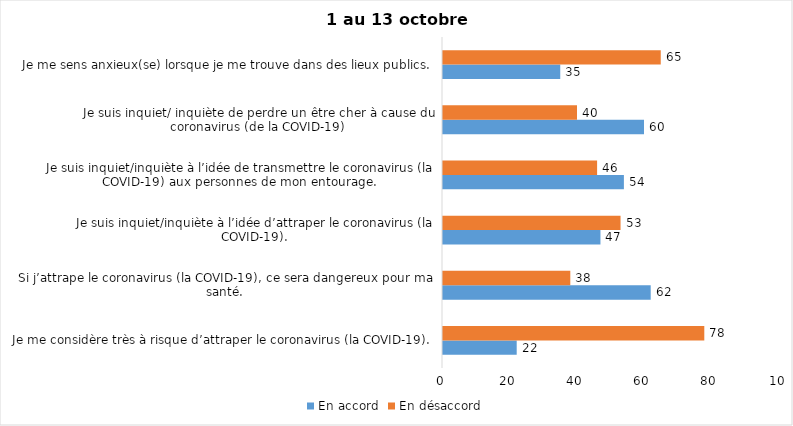
| Category | En accord | En désaccord |
|---|---|---|
| Je me considère très à risque d’attraper le coronavirus (la COVID-19). | 22 | 78 |
| Si j’attrape le coronavirus (la COVID-19), ce sera dangereux pour ma santé. | 62 | 38 |
| Je suis inquiet/inquiète à l’idée d’attraper le coronavirus (la COVID-19). | 47 | 53 |
| Je suis inquiet/inquiète à l’idée de transmettre le coronavirus (la COVID-19) aux personnes de mon entourage. | 54 | 46 |
| Je suis inquiet/ inquiète de perdre un être cher à cause du coronavirus (de la COVID-19) | 60 | 40 |
| Je me sens anxieux(se) lorsque je me trouve dans des lieux publics. | 35 | 65 |